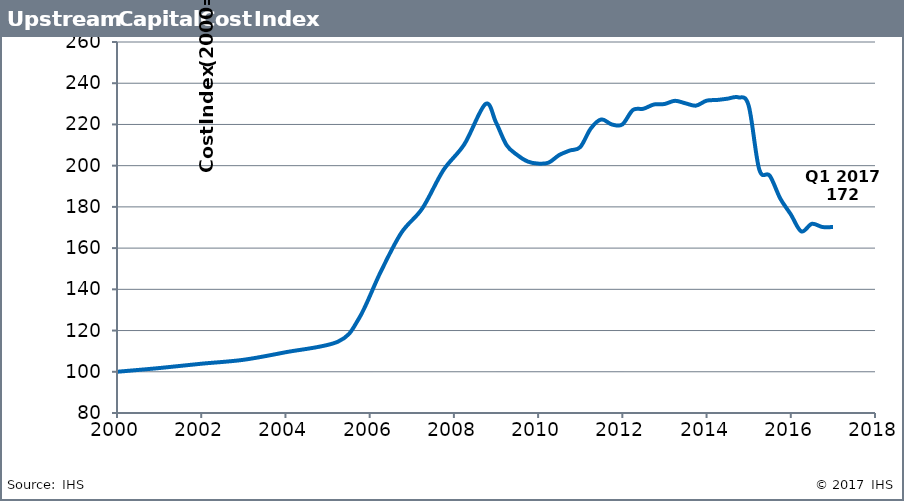
| Category | UCCI |
|---|---|
| 2000.0 | 100 |
| 2001.0 | 101.8 |
| 2002.0 | 103.9 |
| 2003.0 | 105.8 |
| 2004.0 | 109.462 |
| 2005.25 | 114.642 |
| 2005.75 | 126.023 |
| 2006.25 | 147.973 |
| 2006.75 | 167.369 |
| 2007.25 | 179.244 |
| 2007.75 | 197.8 |
| 2008.25 | 210.45 |
| 2008.75 | 229.896 |
| 2009.0 | 221 |
| 2009.25 | 210 |
| 2009.5 | 205.236 |
| 2009.75 | 202.036 |
| 2010.0 | 201 |
| 2010.25 | 201.483 |
| 2010.5 | 205.14 |
| 2010.75 | 207.332 |
| 2011.0 | 209 |
| 2011.25 | 218 |
| 2011.5 | 222.425 |
| 2011.75 | 220 |
| 2012.0 | 220 |
| 2012.25 | 227 |
| 2012.5 | 227.609 |
| 2012.75 | 229.683 |
| 2013.0 | 229.912 |
| 2013.25 | 231.471 |
| 2013.5 | 230.245 |
| 2013.75 | 229.132 |
| 2014.0 | 231.54 |
| 2014.25 | 231.871 |
| 2014.5 | 232.505 |
| 2014.75 | 233.169 |
| 2015.0 | 229.139 |
| 2015.25 | 198.243 |
| 2015.5 | 195.148 |
| 2015.75 | 184.075 |
| 2016.0 | 176.374 |
| 2016.25 | 168.112 |
| 2016.5 | 171.777 |
| 2016.75 | 170.234 |
| 2017.0 | 170.229 |